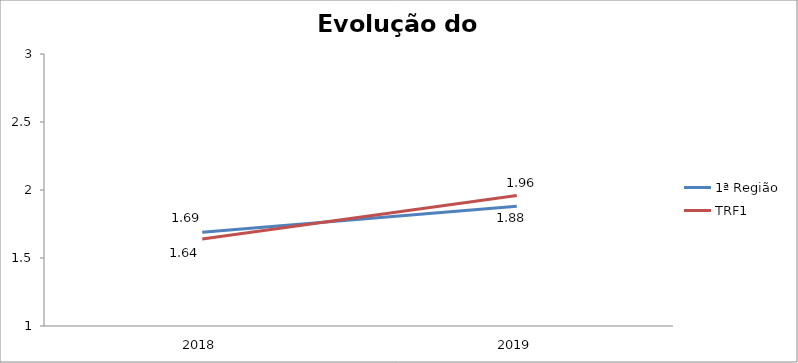
| Category | 1ª Região | TRF1 |
|---|---|---|
| 0 | 1.69 | 1.64 |
| 1 | 1.88 | 1.96 |